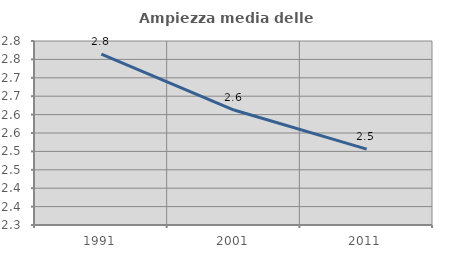
| Category | Ampiezza media delle famiglie |
|---|---|
| 1991.0 | 2.764 |
| 2001.0 | 2.612 |
| 2011.0 | 2.506 |